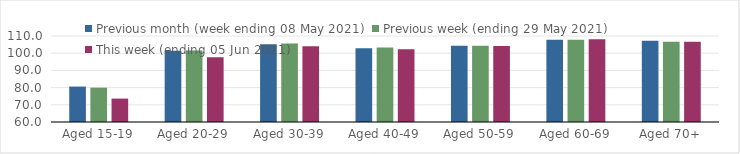
| Category | Previous month (week ending 08 May 2021) | Previous week (ending 29 May 2021) | This week (ending 05 Jun 2021) |
|---|---|---|---|
| Aged 15-19 | 80.6 | 79.96 | 73.6 |
| Aged 20-29 | 101.42 | 101.51 | 97.63 |
| Aged 30-39 | 105.15 | 105.57 | 103.97 |
| Aged 40-49 | 102.93 | 103.26 | 102.27 |
| Aged 50-59 | 104.38 | 104.37 | 104.13 |
| Aged 60-69 | 107.83 | 107.76 | 108.11 |
| Aged 70+ | 107.25 | 106.65 | 106.66 |